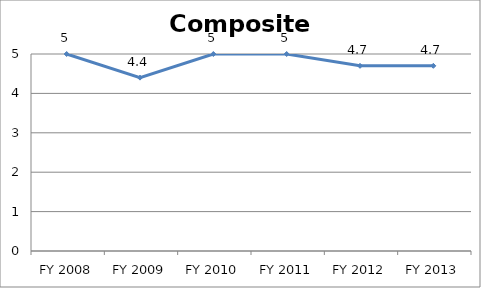
| Category | Composite score |
|---|---|
| FY 2013 | 4.7 |
| FY 2012 | 4.7 |
| FY 2011 | 5 |
| FY 2010 | 5 |
| FY 2009 | 4.4 |
| FY 2008 | 5 |